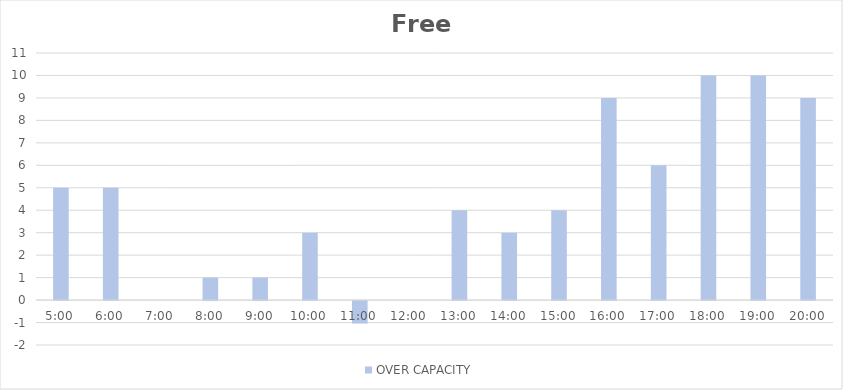
| Category | OVER CAPACITY |
|---|---|
| 0.20833333333333334 | 5 |
| 0.25 | 5 |
| 0.2916666666666667 | 0 |
| 0.3333333333333333 | 1 |
| 0.375 | 1 |
| 0.4166666666666667 | 3 |
| 0.4583333333333333 | -1 |
| 0.5 | 0 |
| 0.5416666666666666 | 4 |
| 0.5833333333333334 | 3 |
| 0.625 | 4 |
| 0.6666666666666666 | 9 |
| 0.7083333333333334 | 6 |
| 0.75 | 10 |
| 0.7916666666666666 | 10 |
| 0.8333333333333334 | 9 |